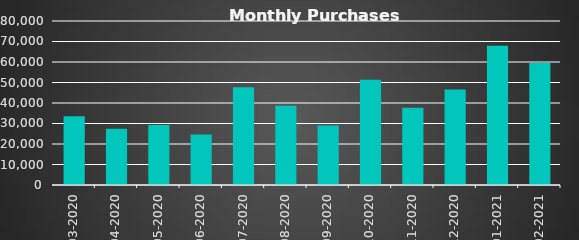
| Category |  Purchases  |
|---|---|
| 2020-03-31 | 33555.6 |
| 2020-04-30 | 27479.4 |
| 2020-05-31 | 29260.4 |
| 2020-06-30 | 24586.08 |
| 2020-07-31 | 47623.2 |
| 2020-08-31 | 38697 |
| 2020-09-30 | 28984.2 |
| 2020-10-31 | 51385.2 |
| 2020-11-30 | 37716.6 |
| 2020-12-31 | 46547.04 |
| 2021-01-31 | 67969.92 |
| 2021-02-28 | 59489.76 |